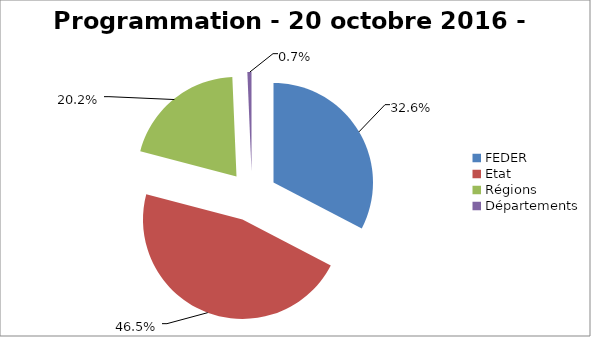
| Category | Series 0 |
|---|---|
| FEDER | 1782249.462 |
| Etat | 2537802.793 |
| Régions | 1105809.79 |
| Départements | 36479.63 |